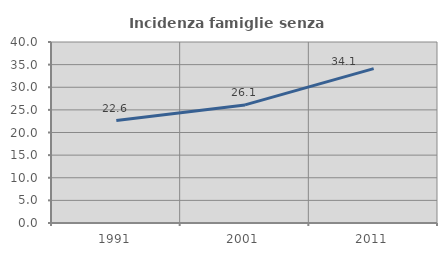
| Category | Incidenza famiglie senza nuclei |
|---|---|
| 1991.0 | 22.632 |
| 2001.0 | 26.098 |
| 2011.0 | 34.106 |